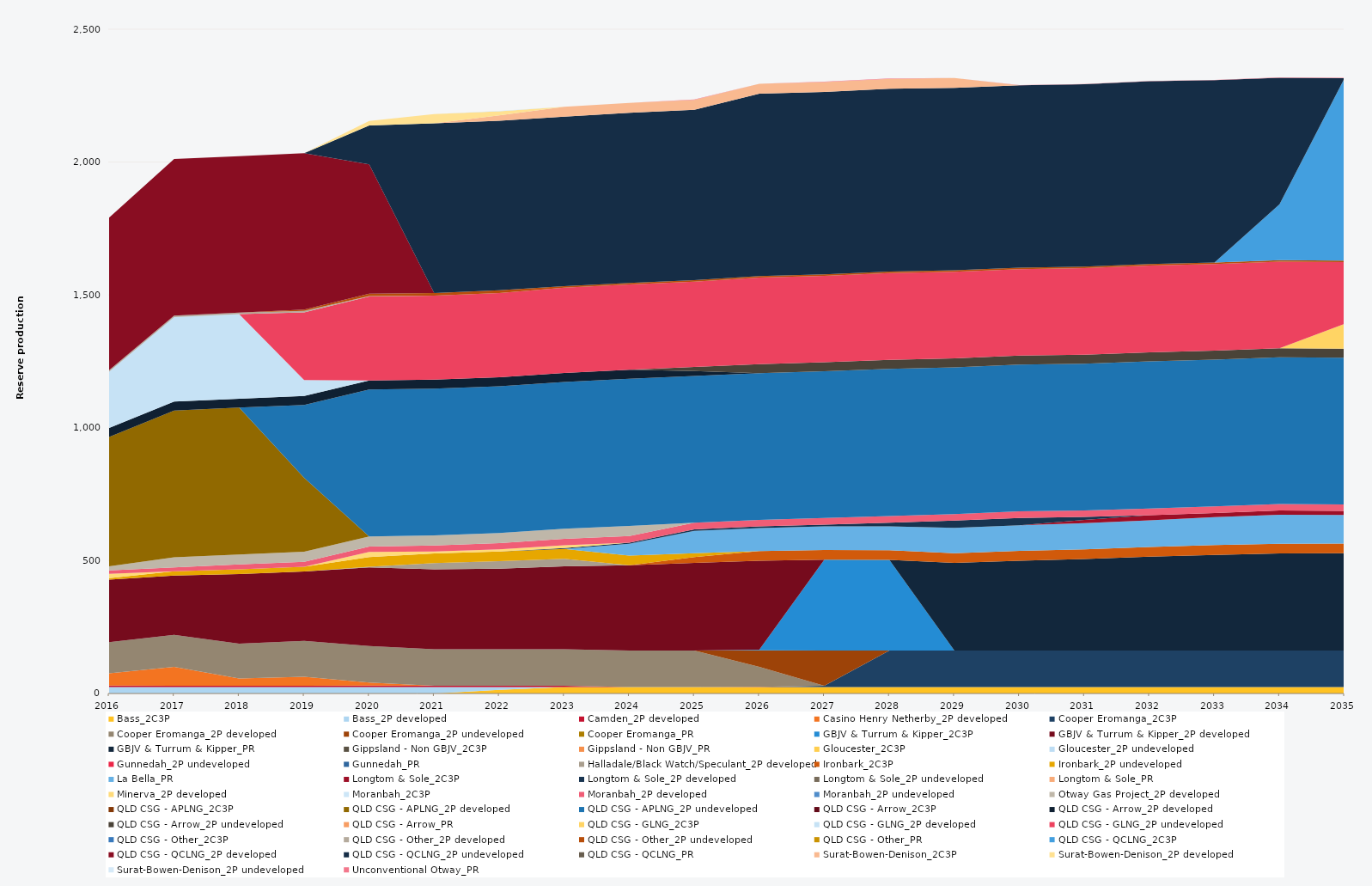
| Category | Bass_2C3P | Bass_2P developed | Camden_2P developed | Casino Henry Netherby_2P developed | Cooper Eromanga_2C3P | Cooper Eromanga_2P developed | Cooper Eromanga_2P undeveloped | Cooper Eromanga_PR | GBJV & Turrum & Kipper_2C3P | GBJV & Turrum & Kipper_2P developed | GBJV & Turrum & Kipper_PR | Gippsland - Non GBJV_2C3P | Gippsland - Non GBJV_PR | Gloucester_2C3P | Gloucester_2P undeveloped | Gunnedah_2P undeveloped | Gunnedah_PR | Halladale/Black Watch/Speculant_2P developed | Ironbark_2C3P | Ironbark_2P undeveloped | La Bella_PR | Longtom & Sole_2C3P | Longtom & Sole_2P developed | Longtom & Sole_2P undeveloped | Longtom & Sole_PR | Minerva_2P developed | Moranbah_2C3P | Moranbah_2P developed | Moranbah_2P undeveloped | Otway Gas Project_2P developed | QLD CSG - APLNG_2C3P | QLD CSG - APLNG_2P developed | QLD CSG - APLNG_2P undeveloped | QLD CSG - Arrow_2C3P | QLD CSG - Arrow_2P developed | QLD CSG - Arrow_2P undeveloped | QLD CSG - Arrow_PR | QLD CSG - GLNG_2C3P | QLD CSG - GLNG_2P developed | QLD CSG - GLNG_2P undeveloped | QLD CSG - Other_2C3P | QLD CSG - Other_2P developed | QLD CSG - Other_2P undeveloped | QLD CSG - Other_PR | QLD CSG - QCLNG_2C3P | QLD CSG - QCLNG_2P developed | QLD CSG - QCLNG_2P undeveloped | QLD CSG - QCLNG_PR | Surat-Bowen-Denison_2C3P | Surat-Bowen-Denison_2P developed | Surat-Bowen-Denison_2P undeveloped | Unconventional Otway_PR |
|---|---|---|---|---|---|---|---|---|---|---|---|---|---|---|---|---|---|---|---|---|---|---|---|---|---|---|---|---|---|---|---|---|---|---|---|---|---|---|---|---|---|---|---|---|---|---|---|---|---|---|---|---|
| 2016 | 0 | 24.522 | 5 | 46.799 | 0 | 117.222 | 0 | 0 | 0 | 235.041 | 0 | 0 | 0 | 0 | 0 | 0 | 0 | 0 | 0 | 5.693 | 0 | 0 | 0 | 0 | 0 | 16 | 0 | 13.152 | 0 | 15.606 | 0 | 486.488 | 0 | 0 | 34.038 | 0 | 0 | 0 | 211.509 | 0 | 0 | 5.856 | 0 | 0 | 0 | 573.724 | 0 | 0 | 0 | 0 | 0 | 0 |
| 2017 | 0 | 24.455 | 5 | 70.439 | 0 | 121.164 | 0 | 0 | 0 | 222.562 | 0 | 0 | 0 | 0 | 0 | 0 | 0 | 0 | 0 | 16.208 | 0 | 0 | 0 | 0 | 0 | 0 | 0 | 14.795 | 0 | 38 | 0 | 552.245 | 0 | 0 | 33.945 | 0 | 0 | 0 | 317.487 | 0 | 0 | 5.84 | 0 | 0 | 0 | 589.555 | 0 | 0 | 0 | 0 | 0 | 0 |
| 2018 | 0 | 24.455 | 5 | 27.379 | 0 | 130.69 | 0 | 0 | 0 | 261.823 | 0 | 0 | 0 | 0 | 0 | 0 | 0 | 0 | 0 | 18.199 | 0 | 0 | 0 | 0 | 0 | 0 | 0 | 17.982 | 0 | 38 | 0 | 552.245 | 0 | 0 | 33.945 | 0 | 0 | 0 | 318.05 | 0 | 0 | 5.84 | 0 | 0 | 0 | 588.729 | 0 | 0 | 0 | 0 | 0 | 0 |
| 2019 | 0 | 24.455 | 5 | 33.563 | 0 | 135.337 | 0 | 0 | 0 | 260.814 | 0 | 0 | 0 | 0 | 0 | 0 | 0 | 0 | 0 | 18.25 | 0 | 0 | 0 | 0 | 0 | 0 | 0 | 18.049 | 0 | 38 | 0 | 278.572 | 273.673 | 0 | 33.945 | 0 | 0 | 0 | 60.255 | 254.155 | 0 | 5.84 | 4.563 | 0 | 0 | 588.925 | 0 | 0 | 0 | 0 | 0 | 0 |
| 2020 | 0 | 24.522 | 5 | 12.08 | 0 | 137.25 | 0 | 0 | 0 | 295.556 | 0 | 0 | 0 | 0 | 0 | 0 | 0 | 2.407 | 0 | 36.6 | 0 | 0 | 0 | 0 | 0 | 19.609 | 0 | 19.619 | 0 | 38 | 0 | 0 | 553.758 | 0 | 34.038 | 0 | 0 | 0 | 0 | 315.78 | 0 | 1.624 | 8.795 | 0 | 0 | 486.467 | 146.964 | 0 | 0 | 16.511 | 0 | 0 |
| 2021 | 0 | 24.455 | 5 | 0 | 0 | 136.875 | 0 | 0 | 0 | 301.268 | 0 | 0 | 0 | 0 | 0 | 0 | 0 | 23.407 | 0 | 36.5 | 0 | 0 | 0 | 0 | 0 | 7.191 | 0 | 22.179 | 0 | 38 | 0 | 0 | 552.245 | 0 | 33.945 | 0 | 0 | 0 | 0 | 315.979 | 0 | 0 | 10.403 | 0 | 0 | 0 | 638.353 | 0 | 0 | 35.106 | 0 | 0 |
| 2022 | 13.672 | 10.783 | 5 | 0 | 0 | 136.875 | 0 | 0 | 0 | 303.647 | 0 | 0 | 0 | 0 | 0 | 0 | 0 | 27.811 | 0 | 36.5 | 0 | 0 | 0 | 0 | 0 | 7.872 | 0 | 24.141 | 0 | 38 | 0 | 0 | 552.245 | 0 | 33.945 | 0 | 0 | 0 | 0 | 316.423 | 0 | 0 | 10.403 | 0 | 0 | 0 | 638.37 | 0 | 20.033 | 15.197 | 2 | 0 |
| 2023 | 24.455 | 0 | 5 | 0 | 0 | 136.875 | 0 | 0 | 0 | 312.649 | 0 | 0 | 0 | 0 | 0 | 0 | 0 | 28.376 | 0 | 36.5 | 0 | 0 | 3.645 | 0 | 0 | 10.079 | 0 | 24.787 | 0 | 38 | 0 | 0 | 552.245 | 0 | 33.945 | 0 | 0 | 0 | 0 | 320.755 | 0 | 0 | 5.84 | 0 | 0 | 0 | 638.027 | 0 | 37.23 | 0 | 0 | 0 |
| 2024 | 24.522 | 0 | 0 | 0 | 0 | 137.25 | 0 | 0 | 0 | 320.648 | 0 | 0 | 0 | 0 | 0 | 0 | 0 | 0 | 0 | 36.6 | 44.609 | 0 | 4.054 | 0 | 0 | 0 | 0 | 24.888 | 0 | 38 | 0 | 0 | 553.758 | 0 | 34.038 | 0 | 0 | 0 | 0 | 321.248 | 0 | 0 | 5.856 | 0 | 0 | 0 | 639.799 | 0 | 37.332 | 0 | 0 | 0 |
| 2025 | 24.455 | 0 | 0 | 0 | 0 | 136.875 | 0 | 0 | 0 | 330.375 | 0 | 0 | 0 | 0 | 0 | 0 | 0 | 0 | 21.549 | 14.951 | 83.83 | 0 | 6.025 | 0 | 0 | 0 | 0 | 24.82 | 0 | 0 | 0 | 0 | 552.245 | 0 | 18.166 | 15.779 | 0 | 0 | 0 | 320.874 | 0 | 0 | 5.84 | 0 | 0 | 0 | 641.111 | 0 | 37.23 | 0 | 0 | 1.495 |
| 2026 | 24.455 | 0 | 1 | 0 | 0 | 74.585 | 62.29 | 0 | 2.305 | 334.723 | 0 | 0 | 0 | 0 | 0 | 0 | 0 | 0 | 36.5 | 0 | 86.924 | 0 | 6.043 | 0 | 0 | 0 | 0 | 24.82 | 0 | 0 | 0 | 0 | 552.245 | 0 | 0 | 33.945 | 0 | 0 | 0 | 325.58 | 0 | 0 | 5.84 | 0 | 0 | 0 | 686.2 | 0 | 37.23 | 0 | 0 | 0.346 |
| 2027 | 24.455 | 0 | 0 | 0 | 4.583 | 0 | 132.292 | 0 | 342.614 | 0 | 0 | 0 | 0 | 0 | 0 | 0 | 0 | 0 | 36.5 | 0 | 88.317 | 0 | 6.652 | 0 | 0 | 0 | 0 | 24.82 | 0 | 0 | 0 | 0 | 552.245 | 0 | 0 | 33.945 | 0 | 0 | 0 | 325.58 | 0 | 0 | 5.84 | 0 | 0 | 0 | 686.2 | 0 | 37.23 | 0 | 0 | 1.418 |
| 2028 | 24.522 | 0 | 0 | 0 | 137.25 | 0 | 0 | 0 | 340.795 | 0 | 0 | 0 | 0 | 0 | 0 | 0 | 0 | 0 | 36.6 | 0 | 90.155 | 0 | 13.798 | 0 | 0 | 0 | 0 | 24.888 | 0 | 0 | 0 | 0 | 553.758 | 0 | 0 | 34.038 | 0 | 0 | 0 | 326.472 | 0 | 0 | 5.856 | 0 | 0 | 0 | 688.08 | 0 | 37.332 | 0 | 0 | 0.959 |
| 2029 | 24.455 | 0 | 0 | 0 | 136.875 | 0 | 0 | 0 | 0 | 0 | 329.882 | 0 | 0 | 0 | 0 | 0 | 0 | 0 | 36.5 | 0 | 95.444 | 0 | 27.375 | 0 | 0 | 0 | 0 | 24.82 | 0 | 0 | 0 | 0 | 552.245 | 0 | 0 | 33.945 | 0 | 0 | 0 | 325.58 | 0 | 0 | 5.84 | 0 | 0 | 0 | 686.2 | 0 | 37.083 | 0 | 0 | 0.319 |
| 2030 | 24.455 | 0 | 0 | 0 | 136.875 | 0 | 0 | 0 | 0 | 0 | 338.656 | 0 | 0 | 0 | 0 | 0 | 0 | 0 | 36.5 | 0 | 96.556 | 0 | 27.375 | 0 | 0 | 0 | 0 | 24.82 | 0 | 0 | 0 | 0 | 552.245 | 0 | 0 | 33.945 | 0 | 0 | 0 | 325.58 | 0 | 0 | 5.84 | 0 | 0 | 0 | 686.2 | 0 | 0 | 0 | 0 | 0.85 |
| 2031 | 24.455 | 0 | 0 | 0 | 136.875 | 0 | 0 | 0 | 0 | 0 | 345.041 | 0 | 0 | 0 | 0 | 0 | 0 | 0 | 36.5 | 0 | 98.269 | 11.787 | 11.515 | 0 | 0 | 0 | 0 | 24.82 | 0 | 0 | 0 | 0 | 552.245 | 0 | 0 | 33.945 | 0 | 0 | 0 | 325.58 | 0 | 0 | 5.84 | 0 | 0 | 0 | 686.2 | 0 | 0 | 0 | 0 | 0.769 |
| 2032 | 24.522 | 0 | 0 | 0 | 137.25 | 0 | 0 | 0 | 0 | 0 | 353.221 | 0 | 0 | 0 | 0 | 0 | 0 | 0 | 36.6 | 0 | 100.242 | 19.261 | 0 | 0 | 0 | 0 | 0 | 24.888 | 0 | 0 | 0 | 0 | 553.758 | 0 | 0 | 34.038 | 0 | 0 | 0 | 326.472 | 0 | 0 | 5.856 | 0 | 0 | 0 | 688.08 | 0 | 0 | 0 | 0 | 1.337 |
| 2033 | 24.455 | 0 | 0 | 0 | 136.875 | 0 | 0 | 0 | 0 | 0 | 360.471 | 0 | 0 | 0 | 0 | 0 | 0 | 0 | 36.5 | 0 | 105.351 | 15.707 | 0 | 0 | 0 | 0 | 0 | 24.82 | 0 | 0 | 0 | 0 | 552.245 | 0 | 0 | 33.945 | 0 | 0 | 0 | 325.58 | 0 | 0 | 5.84 | 0 | 0 | 0 | 686.2 | 0 | 0 | 0 | 0 | 0.805 |
| 2034 | 24.455 | 0 | 0 | 0 | 136.875 | 0 | 0 | 0 | 0 | 0 | 365.789 | 0 | 0 | 0 | 0 | 0 | 0 | 0 | 36.5 | 0 | 109.264 | 15.711 | 0 | 0 | 0 | 0 | 0 | 24.82 | 0 | 0 | 0 | 0 | 552.245 | 0 | 0 | 33.945 | 0 | 0 | 0 | 325.58 | 0 | 0 | 5.84 | 0 | 210.139 | 0 | 476.061 | 0 | 0 | 0 | 0 | 1.477 |
| 2035 | 24.455 | 0 | 0 | 0 | 136.875 | 0 | 0 | 0 | 0 | 0 | 366.262 | 0 | 0 | 0 | 0 | 0 | 0 | 0 | 36.5 | 0 | 108.04 | 14.877 | 0 | 0 | 0 | 0 | 0 | 24.82 | 0 | 0 | 0 | 0 | 552.245 | 0 | 0 | 33.945 | 0 | 92.738 | 0 | 232.842 | 0 | 0 | 5.84 | 0 | 686.2 | 0 | 0 | 0 | 0 | 0 | 0 | 1.224 |